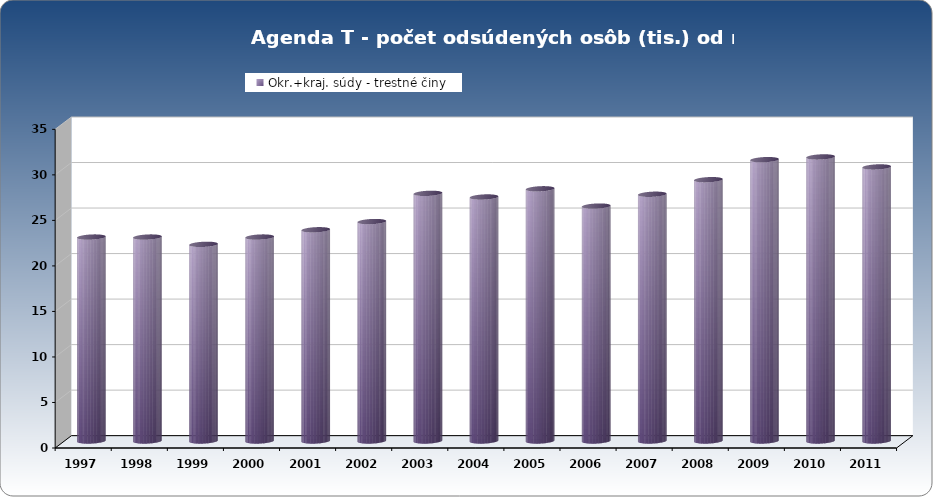
| Category | Okr.+kraj. súdy - trestné činy |
|---|---|
| 1997.0 | 22.4 |
| 1998.0 | 22.4 |
| 1999.0 | 21.6 |
| 2000.0 | 22.4 |
| 2001.0 | 23.2 |
| 2002.0 | 24.1 |
| 2003.0 | 27.2 |
| 2004.0 | 26.8 |
| 2005.0 | 27.7 |
| 2006.0 | 25.8 |
| 2007.0 | 27.1 |
| 2008.0 | 28.7 |
| 2009.0 | 30.9 |
| 2010.0 | 31.2 |
| 2011.0 | 30.1 |